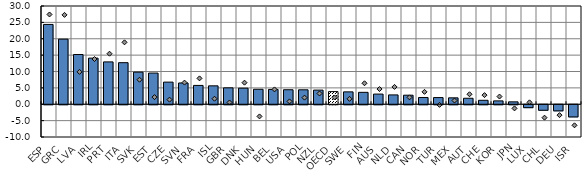
| Category | Average deviation of youth unemployment in 2016q1 from pre-crisis rate |
|---|---|
| ESP | 24.37 |
| GRC | 19.877 |
| LVA | 15.183 |
| IRL | 14.085 |
| PRT | 12.931 |
| ITA | 12.692 |
| SVK | 9.804 |
| EST | 9.524 |
| CZE | 6.758 |
| SVN | 6.498 |
| FRA | 5.752 |
| ISL | 5.623 |
| GBR | 5.012 |
| DNK | 4.908 |
| HUN | 4.573 |
| BEL | 4.535 |
| USA | 4.43 |
| POL | 4.411 |
| NZL | 4.322 |
| OECD | 3.864 |
| SWE | 3.783 |
| FIN | 3.639 |
| AUS | 3.104 |
| NLD | 2.849 |
| CAN | 2.765 |
| NOR | 2.064 |
| TUR | 2.039 |
| MEX | 1.957 |
| AUT | 1.828 |
| CHE | 1.204 |
| KOR | 1.026 |
| JPN | 0.732 |
| LUX | -0.89 |
| CHL | -1.687 |
| DEU | -1.868 |
| ISR | -3.717 |